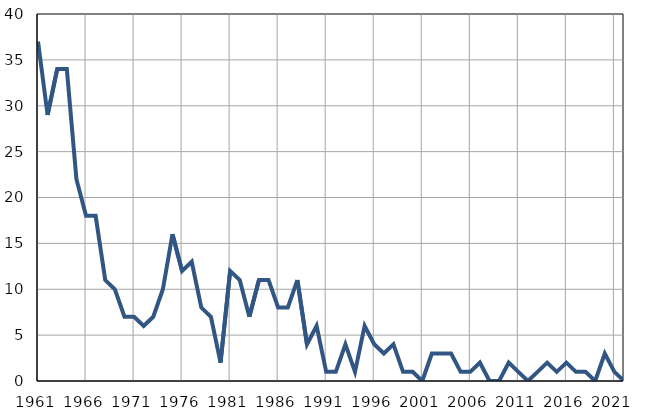
| Category | Infants
deaths |
|---|---|
| 1961.0 | 37 |
| 1962.0 | 29 |
| 1963.0 | 34 |
| 1964.0 | 34 |
| 1965.0 | 22 |
| 1966.0 | 18 |
| 1967.0 | 18 |
| 1968.0 | 11 |
| 1969.0 | 10 |
| 1970.0 | 7 |
| 1971.0 | 7 |
| 1972.0 | 6 |
| 1973.0 | 7 |
| 1974.0 | 10 |
| 1975.0 | 16 |
| 1976.0 | 12 |
| 1977.0 | 13 |
| 1978.0 | 8 |
| 1979.0 | 7 |
| 1980.0 | 2 |
| 1981.0 | 12 |
| 1982.0 | 11 |
| 1983.0 | 7 |
| 1984.0 | 11 |
| 1985.0 | 11 |
| 1986.0 | 8 |
| 1987.0 | 8 |
| 1988.0 | 11 |
| 1989.0 | 4 |
| 1990.0 | 6 |
| 1991.0 | 1 |
| 1992.0 | 1 |
| 1993.0 | 4 |
| 1994.0 | 1 |
| 1995.0 | 6 |
| 1996.0 | 4 |
| 1997.0 | 3 |
| 1998.0 | 4 |
| 1999.0 | 1 |
| 2000.0 | 1 |
| 2001.0 | 0 |
| 2002.0 | 3 |
| 2003.0 | 3 |
| 2004.0 | 3 |
| 2005.0 | 1 |
| 2006.0 | 1 |
| 2007.0 | 2 |
| 2008.0 | 0 |
| 2009.0 | 0 |
| 2010.0 | 2 |
| 2011.0 | 1 |
| 2012.0 | 0 |
| 2013.0 | 1 |
| 2014.0 | 2 |
| 2015.0 | 1 |
| 2016.0 | 2 |
| 2017.0 | 1 |
| 2018.0 | 1 |
| 2019.0 | 0 |
| 2020.0 | 3 |
| 2021.0 | 1 |
| 2022.0 | 0 |